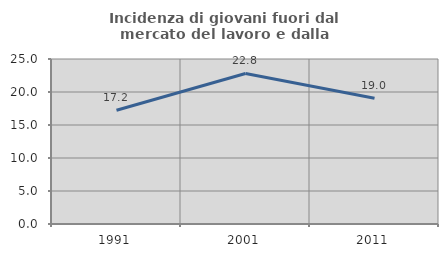
| Category | Incidenza di giovani fuori dal mercato del lavoro e dalla formazione  |
|---|---|
| 1991.0 | 17.235 |
| 2001.0 | 22.809 |
| 2011.0 | 19.048 |